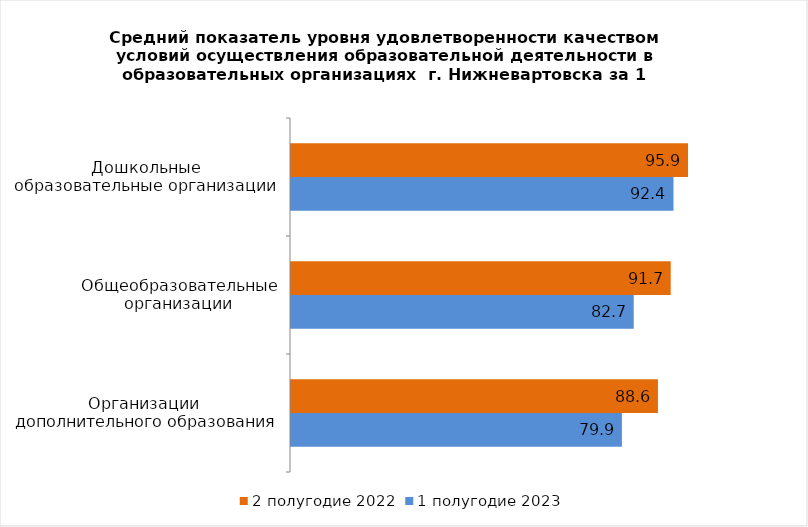
| Category | 2 полугодие 2022 | 1 полугодие 2023 |
|---|---|---|
| 0 | 95.861 | 92.352 |
| 1 | 91.682 | 82.748 |
| 2 | 88.6 | 79.895 |